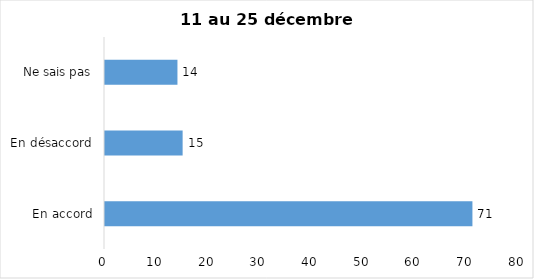
| Category | Series 0 |
|---|---|
| En accord | 71 |
| En désaccord | 15 |
| Ne sais pas | 14 |